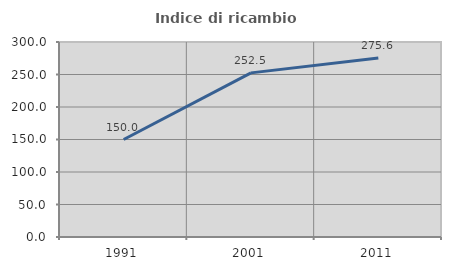
| Category | Indice di ricambio occupazionale  |
|---|---|
| 1991.0 | 150 |
| 2001.0 | 252.489 |
| 2011.0 | 275.559 |